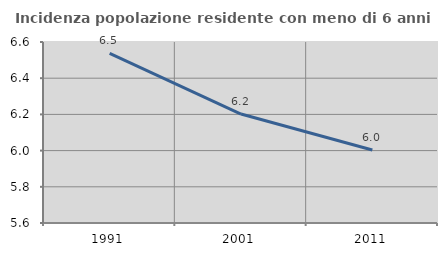
| Category | Incidenza popolazione residente con meno di 6 anni |
|---|---|
| 1991.0 | 6.538 |
| 2001.0 | 6.202 |
| 2011.0 | 6.003 |